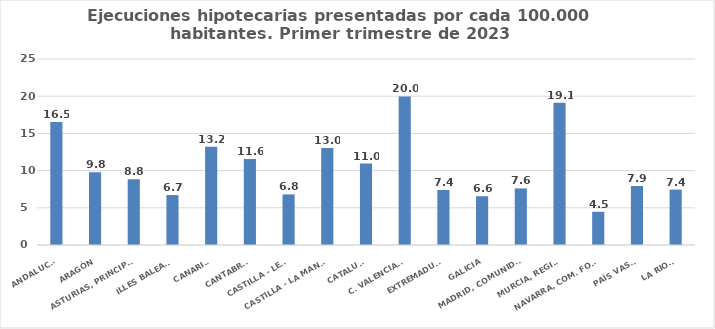
| Category | Series 0 |
|---|---|
| ANDALUCÍA | 16.535 |
| ARAGÓN | 9.783 |
| ASTURIAS, PRINCIPADO | 8.842 |
| ILLES BALEARS | 6.712 |
| CANARIAS | 13.195 |
| CANTABRIA | 11.554 |
| CASTILLA - LEÓN | 6.799 |
| CASTILLA - LA MANCHA | 13.025 |
| CATALUÑA | 10.951 |
| C. VALENCIANA | 19.968 |
| EXTREMADURA | 7.398 |
| GALICIA | 6.556 |
| MADRID, COMUNIDAD | 7.607 |
| MURCIA, REGIÓN | 19.128 |
| NAVARRA, COM. FORAL | 4.463 |
| PAÍS VASCO | 7.928 |
| LA RIOJA | 7.447 |